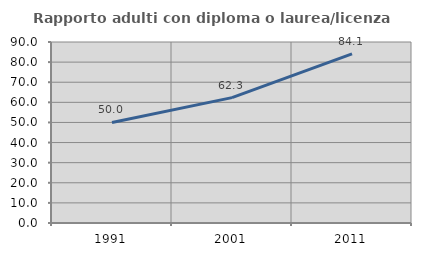
| Category | Rapporto adulti con diploma o laurea/licenza media  |
|---|---|
| 1991.0 | 50 |
| 2001.0 | 62.338 |
| 2011.0 | 84.066 |